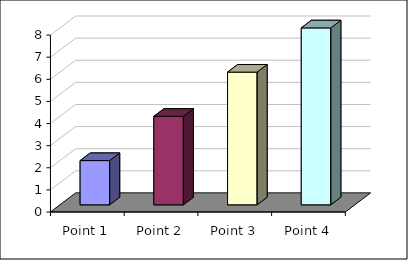
| Category | Series 1 |
|---|---|
| Point 1 | 2 |
| Point 2 | 4 |
| Point 3 | 6 |
| Point 4 | 8 |